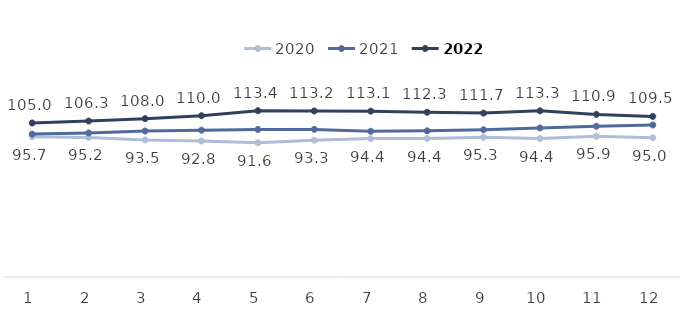
| Category | 2020 | 2021 | 2022 |
|---|---|---|---|
| 1.0 | 95.689 | 97.442 | 105.017 |
| 2.0 | 95.175 | 98.226 | 106.344 |
| 3.0 | 93.481 | 99.53 | 107.96 |
| 4.0 | 92.762 | 100.092 | 109.959 |
| 5.0 | 91.561 | 100.591 | 113.363 |
| 6.0 | 93.264 | 100.652 | 113.2 |
| 7.0 | 94.352 | 99.374 | 113.067 |
| 8.0 | 94.419 | 99.669 | 112.31 |
| 9.0 | 95.283 | 100.412 | 111.748 |
| 10.0 | 94.391 | 101.641 | 113.302 |
| 11.0 | 95.923 | 102.775 | 110.858 |
| 12.0 | 94.968 | 103.664 | 109.474 |